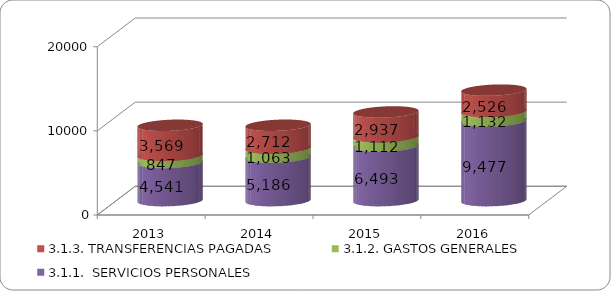
| Category | 3.1.1.  SERVICIOS PERSONALES | 3.1.2. GASTOS GENERALES | 3.1.3. TRANSFERENCIAS PAGADAS |
|---|---|---|---|
| 2013.0 | 4540.975 | 847.167 | 3568.61 |
| 2014.0 | 5185.68 | 1063.131 | 2712.15 |
| 2015.0 | 6493.093 | 1112.11 | 2936.679 |
| 2016.0 | 9476.749 | 1131.552 | 2526.417 |